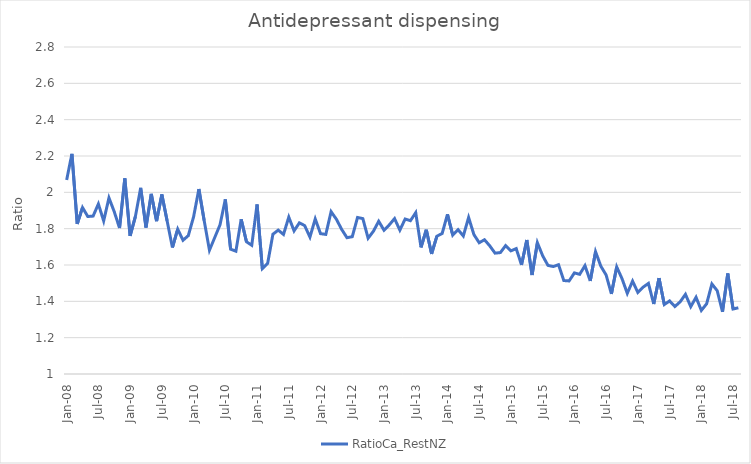
| Category | RatioCa_RestNZ |
|---|---|
| 2008-01-01 | 2.068 |
| 2008-02-01 | 2.212 |
| 2008-03-01 | 1.826 |
| 2008-04-01 | 1.916 |
| 2008-05-01 | 1.867 |
| 2008-06-01 | 1.869 |
| 2008-07-01 | 1.936 |
| 2008-08-01 | 1.843 |
| 2008-09-01 | 1.97 |
| 2008-10-01 | 1.893 |
| 2008-11-01 | 1.804 |
| 2008-12-01 | 2.077 |
| 2009-01-01 | 1.76 |
| 2009-02-01 | 1.867 |
| 2009-03-01 | 2.025 |
| 2009-04-01 | 1.806 |
| 2009-05-01 | 1.992 |
| 2009-06-01 | 1.841 |
| 2009-07-01 | 1.989 |
| 2009-08-01 | 1.843 |
| 2009-09-01 | 1.696 |
| 2009-10-01 | 1.797 |
| 2009-11-01 | 1.736 |
| 2009-12-01 | 1.762 |
| 2010-01-01 | 1.865 |
| 2010-02-01 | 2.018 |
| 2010-03-01 | 1.845 |
| 2010-04-01 | 1.681 |
| 2010-05-01 | 1.751 |
| 2010-06-01 | 1.821 |
| 2010-07-01 | 1.961 |
| 2010-08-01 | 1.687 |
| 2010-09-01 | 1.676 |
| 2010-10-01 | 1.851 |
| 2010-11-01 | 1.728 |
| 2010-12-01 | 1.709 |
| 2011-01-01 | 1.933 |
| 2011-02-01 | 1.58 |
| 2011-03-01 | 1.608 |
| 2011-04-01 | 1.769 |
| 2011-05-01 | 1.792 |
| 2011-06-01 | 1.768 |
| 2011-07-01 | 1.864 |
| 2011-08-01 | 1.788 |
| 2011-09-01 | 1.832 |
| 2011-10-01 | 1.817 |
| 2011-11-01 | 1.754 |
| 2011-12-01 | 1.854 |
| 2012-01-01 | 1.773 |
| 2012-02-01 | 1.768 |
| 2012-03-01 | 1.894 |
| 2012-04-01 | 1.852 |
| 2012-05-01 | 1.796 |
| 2012-06-01 | 1.75 |
| 2012-07-01 | 1.756 |
| 2012-08-01 | 1.862 |
| 2012-09-01 | 1.855 |
| 2012-10-01 | 1.747 |
| 2012-11-01 | 1.786 |
| 2012-12-01 | 1.841 |
| 2013-01-01 | 1.792 |
| 2013-02-01 | 1.821 |
| 2013-03-01 | 1.855 |
| 2013-04-01 | 1.792 |
| 2013-05-01 | 1.853 |
| 2013-06-01 | 1.844 |
| 2013-07-01 | 1.888 |
| 2013-08-01 | 1.697 |
| 2013-09-01 | 1.794 |
| 2013-10-01 | 1.661 |
| 2013-11-01 | 1.758 |
| 2013-12-01 | 1.773 |
| 2014-01-01 | 1.879 |
| 2014-02-01 | 1.764 |
| 2014-03-01 | 1.795 |
| 2014-04-01 | 1.76 |
| 2014-05-01 | 1.862 |
| 2014-06-01 | 1.768 |
| 2014-07-01 | 1.722 |
| 2014-08-01 | 1.739 |
| 2014-09-01 | 1.705 |
| 2014-10-01 | 1.665 |
| 2014-11-01 | 1.668 |
| 2014-12-01 | 1.707 |
| 2015-01-01 | 1.678 |
| 2015-02-01 | 1.69 |
| 2015-03-01 | 1.601 |
| 2015-04-01 | 1.737 |
| 2015-05-01 | 1.545 |
| 2015-06-01 | 1.723 |
| 2015-07-01 | 1.651 |
| 2015-08-01 | 1.598 |
| 2015-09-01 | 1.592 |
| 2015-10-01 | 1.601 |
| 2015-11-01 | 1.515 |
| 2015-12-01 | 1.512 |
| 2016-01-01 | 1.557 |
| 2016-02-01 | 1.549 |
| 2016-03-01 | 1.597 |
| 2016-04-01 | 1.512 |
| 2016-05-01 | 1.673 |
| 2016-06-01 | 1.593 |
| 2016-07-01 | 1.545 |
| 2016-08-01 | 1.441 |
| 2016-09-01 | 1.589 |
| 2016-10-01 | 1.525 |
| 2016-11-01 | 1.444 |
| 2016-12-01 | 1.511 |
| 2017-01-01 | 1.449 |
| 2017-02-01 | 1.478 |
| 2017-03-01 | 1.499 |
| 2017-04-01 | 1.385 |
| 2017-05-01 | 1.528 |
| 2017-06-01 | 1.382 |
| 2017-07-01 | 1.402 |
| 2017-08-01 | 1.371 |
| 2017-09-01 | 1.398 |
| 2017-10-01 | 1.439 |
| 2017-11-01 | 1.371 |
| 2017-12-01 | 1.422 |
| 2018-01-01 | 1.35 |
| 2018-02-01 | 1.386 |
| 2018-03-01 | 1.496 |
| 2018-04-01 | 1.459 |
| 2018-05-01 | 1.342 |
| 2018-06-01 | 1.553 |
| 2018-07-01 | 1.358 |
| 2018-08-01 | 1.364 |